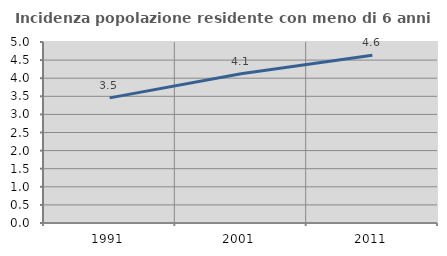
| Category | Incidenza popolazione residente con meno di 6 anni |
|---|---|
| 1991.0 | 3.457 |
| 2001.0 | 4.126 |
| 2011.0 | 4.635 |